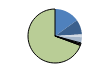
| Category | Series 0 |
|---|---|
| ARRASTRE | 101 |
| CERCO | 59 |
| ATUNEROS CAÑEROS | 1 |
| PALANGRE DE FONDO | 11 |
| PALANGRE DE SUPERFICIE | 23 |
| RASCO | 0 |
| VOLANTA | 5 |
| ARTES FIJAS | 5 |
| ARTES MENORES | 464 |